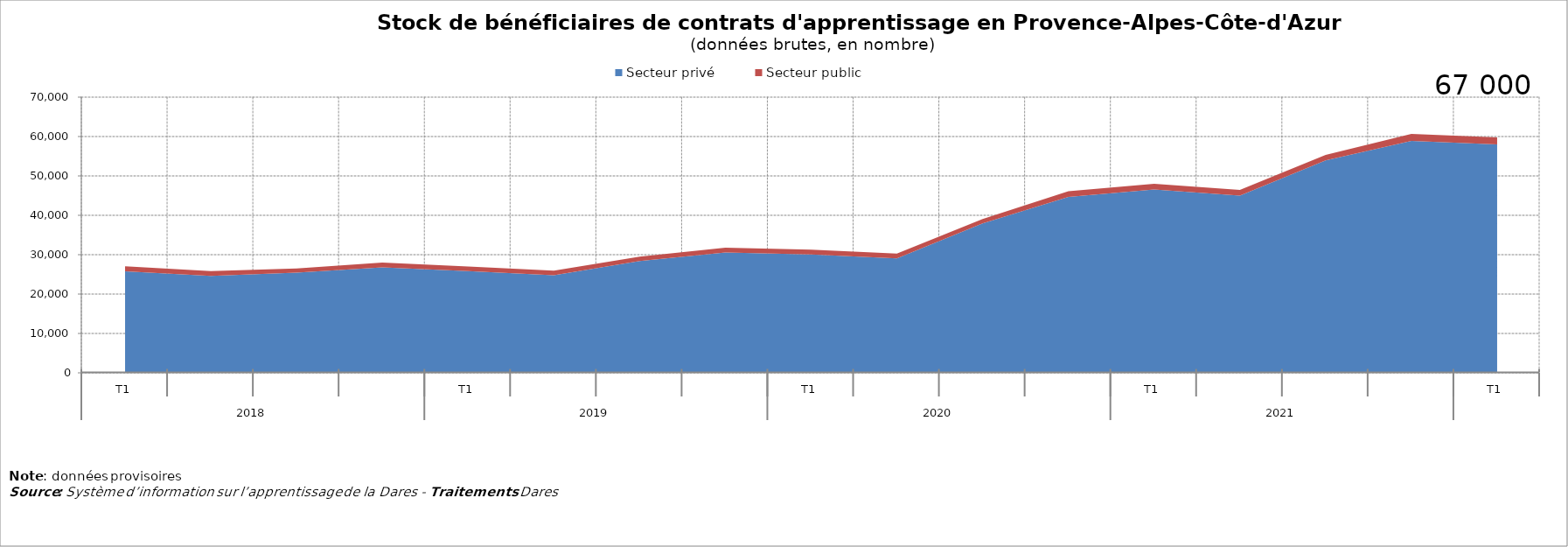
| Category | Secteur privé | Secteur public |
|---|---|---|
| 0 | 25788 | 1256 |
| 1 | 24613 | 1235 |
| 2 | 25429 | 1056 |
| 3 | 26772 | 1201 |
| 4 | 25822 | 1173 |
| 5 | 24768 | 1154 |
| 6 | 28411 | 1086 |
| 7 | 30550 | 1232 |
| 8 | 30059 | 1232 |
| 9 | 29072 | 1221 |
| 10 | 37954 | 1110 |
| 11 | 44685 | 1446 |
| 12 | 46551 | 1469 |
| 13 | 44994 | 1443 |
| 14 | 53930 | 1407 |
| 15 | 58905 | 1763 |
| 16 | 57999 | 1759 |